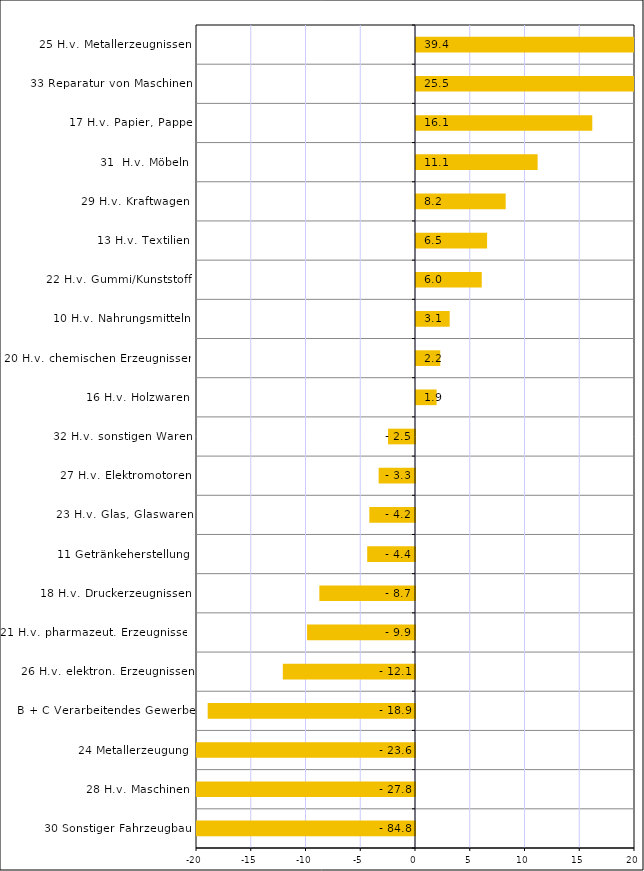
| Category | Series 0 |
|---|---|
| 30 Sonstiger Fahrzeugbau | -84.775 |
| 28 H.v. Maschinen | -27.751 |
| 24 Metallerzeugung | -23.612 |
| B + C Verarbeitendes Gewerbe | -18.932 |
| 26 H.v. elektron. Erzeugnissen | -12.073 |
| 21 H.v. pharmazeut. Erzeugnissen | -9.856 |
| 18 H.v. Druckerzeugnissen | -8.737 |
| 11 Getränkeherstellung | -4.366 |
| 23 H.v. Glas, Glaswaren | -4.17 |
| 27 H.v. Elektromotoren | -3.32 |
| 32 H.v. sonstigen Waren | -2.468 |
| 16 H.v. Holzwaren | 1.882 |
| 20 H.v. chemischen Erzeugnissen | 2.212 |
| 10 H.v. Nahrungsmitteln | 3.074 |
| 22 H.v. Gummi/Kunststoff | 6.004 |
| 13 H.v. Textilien | 6.491 |
| 29 H.v. Kraftwagen | 8.189 |
| 31  H.v. Möbeln | 11.109 |
| 17 H.v. Papier, Pappe | 16.098 |
| 33 Reparatur von Maschinen | 25.529 |
| 25 H.v. Metallerzeugnissen | 39.373 |